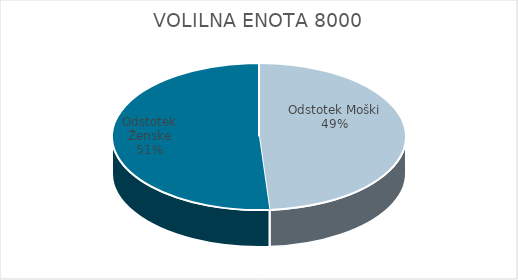
| Category | VOLILNA ENOTA 8000 | #REF! | Slovenija skupaj |
|---|---|---|---|
| Odstotek Moški | 24.26 |  | 25.28 |
| Odstotek Ženske | 25.39 |  | 27.73 |